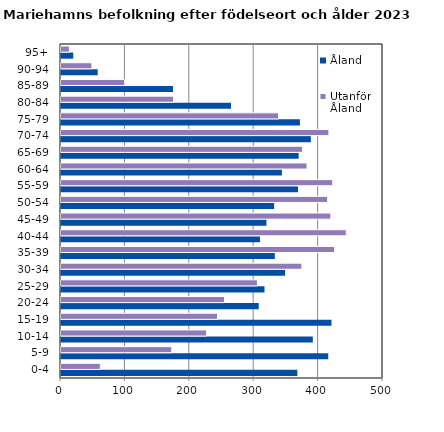
| Category | Åland | Utanför Åland |
|---|---|---|
| 0-4 | 367 | 61 |
| 5-9 | 415 | 172 |
| 10-14 | 391 | 226 |
| 15-19 | 420 | 243 |
| 20-24 | 307 | 254 |
| 25-29 | 316 | 305 |
| 30-34 | 348 | 374 |
| 35-39 | 332 | 425 |
| 40-44 | 309 | 443 |
| 45-49 | 319 | 419 |
| 50-54 | 331 | 414 |
| 55-59 | 368 | 422 |
| 60-64 | 343 | 382 |
| 65-69 | 369 | 375 |
| 70-74 | 388 | 416 |
| 75-79 | 371 | 338 |
| 80-84 | 264 | 175 |
| 85-89 | 174 | 99 |
| 90-94 | 57 | 48 |
| 95+ | 19 | 13 |